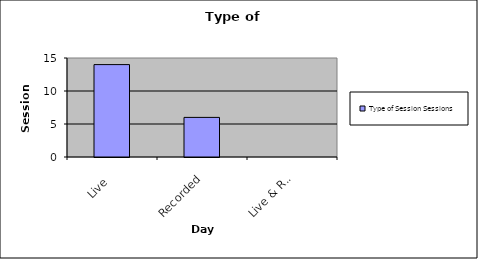
| Category | Type of Session |
|---|---|
| Live | 14 |
| Recorded | 6 |
| Live & Record. | 0 |